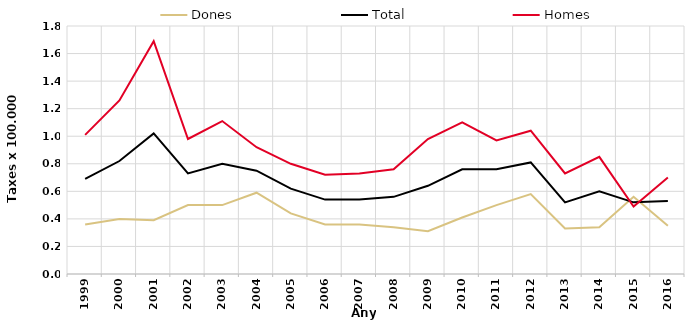
| Category | Dones | Total | Homes |
|---|---|---|---|
| 1999.0 | 0.36 | 0.69 | 1.01 |
| 2000.0 | 0.4 | 0.82 | 1.26 |
| 2001.0 | 0.39 | 1.02 | 1.69 |
| 2002.0 | 0.5 | 0.73 | 0.98 |
| 2003.0 | 0.5 | 0.8 | 1.11 |
| 2004.0 | 0.59 | 0.75 | 0.92 |
| 2005.0 | 0.44 | 0.62 | 0.8 |
| 2006.0 | 0.36 | 0.54 | 0.72 |
| 2007.0 | 0.36 | 0.54 | 0.73 |
| 2008.0 | 0.34 | 0.56 | 0.76 |
| 2009.0 | 0.31 | 0.64 | 0.98 |
| 2010.0 | 0.41 | 0.76 | 1.1 |
| 2011.0 | 0.5 | 0.76 | 0.97 |
| 2012.0 | 0.58 | 0.81 | 1.04 |
| 2013.0 | 0.33 | 0.52 | 0.73 |
| 2014.0 | 0.34 | 0.6 | 0.85 |
| 2015.0 | 0.56 | 0.52 | 0.49 |
| 2016.0 | 0.35 | 0.53 | 0.7 |